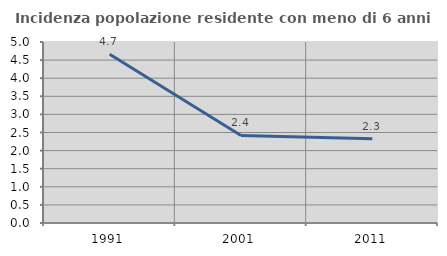
| Category | Incidenza popolazione residente con meno di 6 anni |
|---|---|
| 1991.0 | 4.66 |
| 2001.0 | 2.418 |
| 2011.0 | 2.326 |